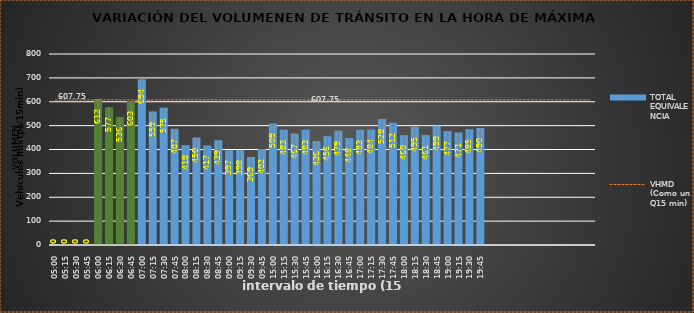
| Category | TOTAL EQUIVALENCIA   |
|---|---|
| 500.0 | 0 |
| 515.0 | 0 |
| 530.0 | 0 |
| 545.0 | 0 |
| 600.0 | 612 |
| 615.0 | 577 |
| 630.0 | 536 |
| 645.0 | 603 |
| 700.0 | 694 |
| 715.0 | 559 |
| 730.0 | 575 |
| 745.0 | 487 |
| 800.0 | 418 |
| 815.0 | 450 |
| 830.0 | 417 |
| 845.0 | 439 |
| 900.0 | 397 |
| 915.0 | 398 |
| 930.0 | 369 |
| 945.0 | 402 |
| 1500.0 | 509 |
| 1515.0 | 483 |
| 1530.0 | 467 |
| 1545.0 | 483 |
| 1600.0 | 436 |
| 1615.0 | 456 |
| 1630.0 | 479 |
| 1645.0 | 448 |
| 1700.0 | 483 |
| 1715.0 | 484 |
| 1730.0 | 528 |
| 1745.0 | 512 |
| 1800.0 | 460 |
| 1815.0 | 495 |
| 1830.0 | 461 |
| 1845.0 | 499 |
| 1900.0 | 477 |
| 1915.0 | 471 |
| 1930.0 | 485 |
| 1945.0 | 490 |